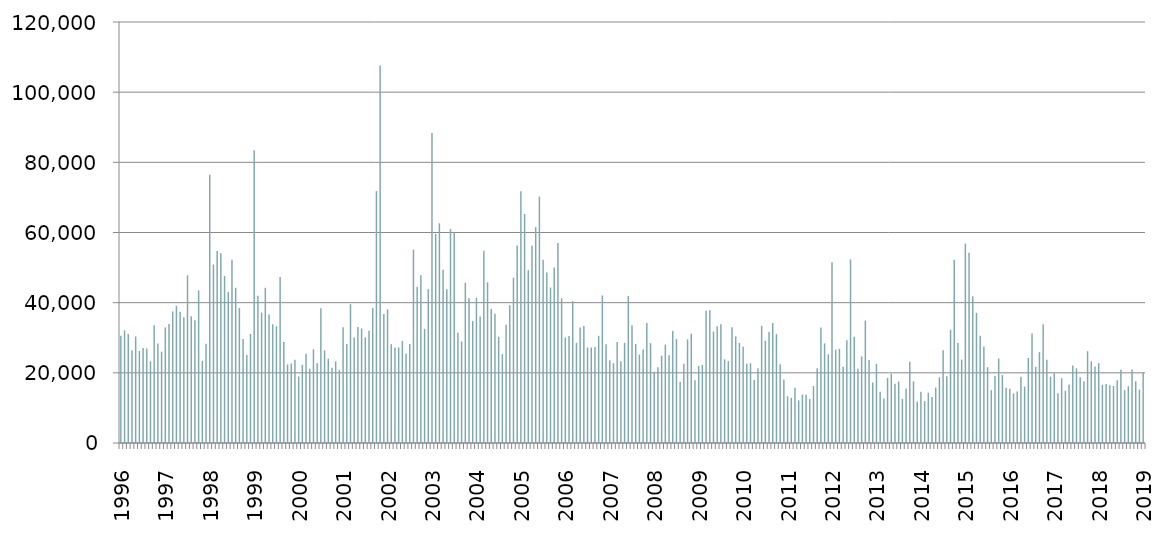
| Category | Series 0 |
|---|---|
| 1996.0 | 30565 |
| nan | 32123 |
| nan | 31044 |
| nan | 26401 |
| nan | 30370 |
| nan | 26254 |
| nan | 27073 |
| nan | 26911 |
| nan | 23273 |
| nan | 33595 |
| nan | 28374 |
| nan | 26036 |
| 1997.0 | 32963 |
| nan | 33890 |
| nan | 37509 |
| nan | 39128 |
| nan | 37399 |
| nan | 35850 |
| nan | 47806 |
| nan | 36117 |
| nan | 35023 |
| nan | 43488 |
| nan | 23397 |
| nan | 28305 |
| 1998.0 | 76429 |
| nan | 50851 |
| nan | 54713 |
| nan | 54112 |
| nan | 47617 |
| nan | 43007 |
| nan | 52250 |
| nan | 44252 |
| nan | 38498 |
| nan | 29638 |
| nan | 25062 |
| nan | 31098 |
| 1999.0 | 83423 |
| nan | 41965 |
| nan | 37191 |
| nan | 44236 |
| nan | 36632 |
| nan | 33845 |
| nan | 33248 |
| nan | 47294 |
| nan | 28815 |
| nan | 22406 |
| nan | 22665 |
| nan | 23726 |
| 2000.0 | 18950 |
| nan | 22265 |
| nan | 25419 |
| nan | 21159 |
| nan | 26713 |
| nan | 22736 |
| nan | 38395 |
| nan | 26379 |
| nan | 24035 |
| nan | 21466 |
| nan | 23271 |
| nan | 20879 |
| 2001.0 | 32965 |
| nan | 28222 |
| nan | 39557 |
| nan | 30046 |
| nan | 33063 |
| nan | 32645 |
| nan | 30113 |
| nan | 31974 |
| nan | 38459 |
| nan | 71817 |
| nan | 107589 |
| nan | 36768 |
| 2002.0 | 38060 |
| nan | 28131 |
| nan | 27242 |
| nan | 27255 |
| nan | 29074 |
| nan | 25539 |
| nan | 28215 |
| nan | 55117 |
| nan | 44435 |
| nan | 47808 |
| nan | 32529 |
| nan | 43837 |
| 2003.0 | 88327 |
| nan | 59597 |
| nan | 62620 |
| nan | 49416 |
| nan | 43798 |
| nan | 61007 |
| nan | 60030 |
| nan | 31400 |
| nan | 28943 |
| nan | 45683 |
| nan | 41241 |
| nan | 34803 |
| 2004.0 | 41446 |
| nan | 36034 |
| nan | 54779 |
| nan | 45804 |
| nan | 38217 |
| nan | 36816 |
| nan | 30279 |
| nan | 25336 |
| nan | 33712 |
| nan | 39233 |
| nan | 47110 |
| nan | 56266 |
| 2005.0 | 71750 |
| nan | 65255 |
| nan | 49275 |
| nan | 56256 |
| nan | 61526 |
| nan | 70220 |
| nan | 52226 |
| nan | 48610 |
| nan | 44307 |
| nan | 49999 |
| nan | 57010 |
| nan | 41262 |
| 2006.0 | 30057 |
| nan | 30492 |
| nan | 40434 |
| nan | 28545 |
| nan | 32934 |
| nan | 33331 |
| nan | 27232 |
| nan | 27227 |
| nan | 27362 |
| nan | 30541 |
| nan | 42045 |
| nan | 28139 |
| 2007.0 | 23612 |
| nan | 22747 |
| nan | 28800 |
| nan | 23287 |
| nan | 28534 |
| nan | 41888 |
| nan | 33468 |
| nan | 28249 |
| nan | 25173 |
| nan | 26672 |
| nan | 34222 |
| nan | 28477 |
| 2008.0 | 20317 |
| nan | 21603 |
| nan | 24900 |
| nan | 28044 |
| nan | 25045 |
| nan | 31958 |
| nan | 29617 |
| nan | 17400 |
| nan | 22606 |
| nan | 29515 |
| nan | 31141 |
| nan | 17871 |
| 2009.0 | 21922 |
| nan | 22273 |
| nan | 37691 |
| nan | 37814 |
| nan | 31759 |
| nan | 33266 |
| nan | 33847 |
| nan | 23861 |
| nan | 23337 |
| nan | 33006 |
| nan | 30362 |
| nan | 28492 |
| 2010.0 | 27450 |
| nan | 22616 |
| nan | 22731 |
| nan | 17976 |
| nan | 21322 |
| nan | 33400 |
| nan | 29135 |
| nan | 31611 |
| nan | 34182 |
| nan | 31026 |
| nan | 22439 |
| nan | 18115 |
| 2011.0 | 13316 |
| nan | 12864 |
| nan | 15754 |
| nan | 12139 |
| nan | 13789 |
| nan | 13734 |
| nan | 12532 |
| nan | 16226 |
| nan | 21335 |
| nan | 32945 |
| nan | 28411 |
| nan | 25267 |
| 2012.0 | 51510 |
| nan | 26596 |
| nan | 26832 |
| nan | 21765 |
| nan | 29303 |
| nan | 52347 |
| nan | 30268 |
| nan | 21147 |
| nan | 24668 |
| nan | 34903 |
| nan | 23658 |
| nan | 17274 |
| 2013.0 | 22563 |
| nan | 14625 |
| nan | 12699 |
| nan | 18561 |
| nan | 19723 |
| nan | 16907 |
| nan | 17520 |
| nan | 12540 |
| nan | 15437 |
| nan | 23184 |
| nan | 17588 |
| nan | 11776 |
| 2014.0 | 14586 |
| nan | 11955 |
| nan | 14313 |
| nan | 13092 |
| nan | 15802 |
| nan | 18723 |
| nan | 26437 |
| nan | 19044 |
| nan | 32284 |
| nan | 52247 |
| nan | 28493 |
| nan | 23777 |
| 2015.0 | 56844 |
| nan | 54236 |
| nan | 41842 |
| nan | 37095 |
| nan | 30576 |
| nan | 27477 |
| nan | 21618 |
| nan | 15038 |
| nan | 19111 |
| nan | 24093 |
| nan | 19410 |
| nan | 15763 |
| 2016.0 | 15437 |
| nan | 14139 |
| nan | 14651 |
| nan | 18849 |
| nan | 16093 |
| nan | 24250 |
| nan | 31240 |
| nan | 21702 |
| nan | 25896 |
| nan | 33869 |
| nan | 23745 |
| nan | 18884 |
| 2017.0 | 19855 |
| nan | 14198 |
| nan | 18466 |
| nan | 14903 |
| nan | 16658 |
| nan | 22085 |
| nan | 21288 |
| nan | 18723 |
| nan | 17630 |
| nan | 26163 |
| nan | 23289 |
| nan | 21791 |
| 2018.0 | 22760 |
| nan | 16515 |
| nan | 16828 |
| nan | 16495 |
| nan | 16238 |
| nan | 17890 |
| nan | 20891 |
| nan | 15083 |
| nan | 16174 |
| nan | 20928 |
| nan | 17597 |
| nan | 15201 |
| 2019.0 | 20124 |